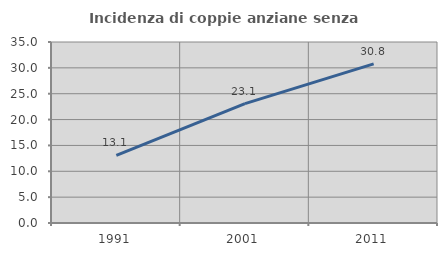
| Category | Incidenza di coppie anziane senza figli  |
|---|---|
| 1991.0 | 13.095 |
| 2001.0 | 23.077 |
| 2011.0 | 30.769 |